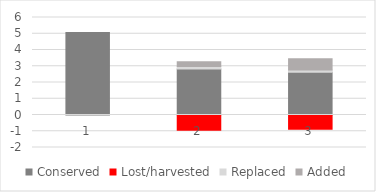
| Category | Conserved | Lost/harvested | Replaced | Added |
|---|---|---|---|---|
| 0 | 5.077 | 0 | 0 | 0 |
| 1 | 2.832 | -0.944 | 0.15 | 0.3 |
| 2 | 2.626 | -0.875 | 0.139 | 0.696 |